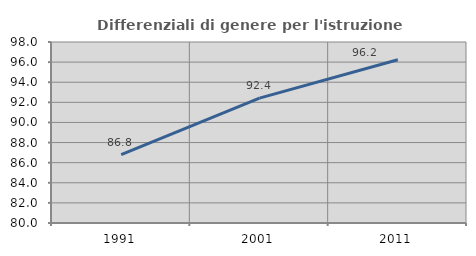
| Category | Differenziali di genere per l'istruzione superiore |
|---|---|
| 1991.0 | 86.795 |
| 2001.0 | 92.415 |
| 2011.0 | 96.235 |